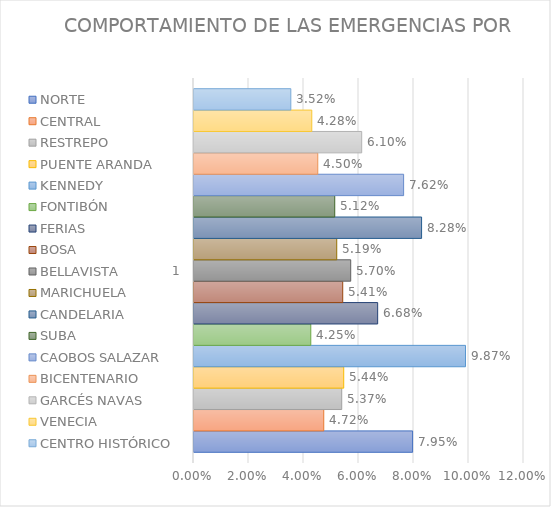
| Category | NORTE | CENTRAL | RESTREPO | PUENTE ARANDA | KENNEDY | FONTIBÓN | FERIAS | BOSA | BELLAVISTA | MARICHUELA | CANDELARIA | SUBA | CAOBOS SALAZAR | BICENTENARIO | GARCÉS NAVAS | VENECIA | CENTRO HISTÓRICO |
|---|---|---|---|---|---|---|---|---|---|---|---|---|---|---|---|---|---|
| 0 | 0.079 | 0.047 | 0.054 | 0.054 | 0.099 | 0.042 | 0.067 | 0.054 | 0.057 | 0.052 | 0.083 | 0.051 | 0.076 | 0.045 | 0.061 | 0.043 | 0.035 |